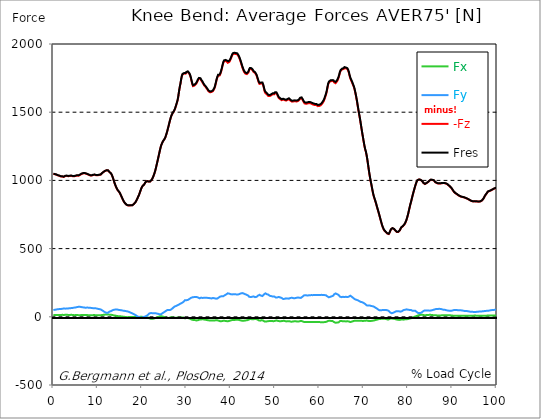
| Category |  Fx |  Fy |  -Fz |  Fres |
|---|---|---|---|---|
| 0.0 | 12.762 | 49.617 | 1047.853 | 1049.235 |
| 0.167348456675344 | 12.591 | 50.67 | 1046.466 | 1047.908 |
| 0.334696913350688 | 12.537 | 51.528 | 1045.206 | 1046.703 |
| 0.5020453700260321 | 12.957 | 52.429 | 1043.916 | 1045.474 |
| 0.669393826701376 | 13.486 | 53.829 | 1041.816 | 1043.429 |
| 0.83674228337672 | 13.048 | 54.717 | 1039.084 | 1040.715 |
| 1.0040907400520642 | 12.744 | 55.466 | 1037.002 | 1038.652 |
| 1.1621420602454444 | 12.494 | 56.147 | 1035.189 | 1036.868 |
| 1.3294905169207885 | 12.634 | 56.64 | 1033.765 | 1035.469 |
| 1.4968389735961325 | 12.914 | 56.914 | 1031.817 | 1033.54 |
| 1.6641874302714765 | 12.762 | 57.316 | 1029.048 | 1030.807 |
| 1.8315358869468206 | 13.912 | 57.736 | 1029.225 | 1031.026 |
| 1.9988843436221646 | 14.752 | 58.661 | 1028.3 | 1030.174 |
| 2.1662328002975086 | 14.143 | 59.817 | 1026.577 | 1028.513 |
| 2.333581256972853 | 13.243 | 60.815 | 1025.226 | 1027.204 |
| 2.5009297136481967 | 13.322 | 61.004 | 1027.557 | 1029.553 |
| 2.6682781703235405 | 14.715 | 59.805 | 1031.598 | 1033.546 |
| 2.8356266269988843 | 15.537 | 59.72 | 1033.527 | 1035.475 |
| 3.002975083674229 | 15.494 | 60.316 | 1033.327 | 1035.304 |
| 3.1703235403495724 | 14.977 | 60.632 | 1032.134 | 1034.112 |
| 3.337671997024917 | 13.65 | 61.326 | 1030.831 | 1032.821 |
| 3.4957233172182973 | 12.738 | 62.081 | 1030.357 | 1032.389 |
| 3.663071773893641 | 12.981 | 62.562 | 1031.848 | 1033.905 |
| 3.8304202305689854 | 14.18 | 62.836 | 1033.588 | 1035.67 |
| 3.997768687244329 | 14.685 | 63.834 | 1033.868 | 1035.998 |
| 4.165117143919673 | 14.423 | 64.686 | 1032.462 | 1034.641 |
| 4.332465600595017 | 13.535 | 65.075 | 1030.673 | 1032.864 |
| 4.499814057270361 | 12.403 | 66.286 | 1029.797 | 1032.049 |
| 4.667162513945706 | 12.062 | 67.114 | 1029.9 | 1032.195 |
| 4.834510970621049 | 12.019 | 67.795 | 1030.649 | 1032.974 |
| 5.001859427296393 | 12.494 | 68.246 | 1032.493 | 1034.836 |
| 5.169207883971737 | 13.249 | 69.585 | 1034.191 | 1036.631 |
| 5.336556340647081 | 13.596 | 70.96 | 1035.39 | 1037.915 |
| 5.503904797322425 | 12.865 | 72.36 | 1034.745 | 1037.361 |
| 5.671253253997769 | 11.812 | 73.54 | 1034.312 | 1036.996 |
| 5.82930457419115 | 11.204 | 74.082 | 1035.633 | 1038.353 |
| 5.996653030866494 | 11.794 | 73.419 | 1040.051 | 1042.723 |
| 6.164001487541838 | 12.804 | 71.861 | 1044.756 | 1047.312 |
| 6.331349944217181 | 13.255 | 71.088 | 1046.983 | 1049.484 |
| 6.498698400892526 | 13.164 | 70.924 | 1047.713 | 1050.202 |
| 6.66604685756787 | 13.942 | 69.566 | 1050.805 | 1053.209 |
| 6.833395314243213 | 14.35 | 68.532 | 1052.205 | 1054.535 |
| 7.000743770918558 | 13.821 | 67.363 | 1052.734 | 1054.986 |
| 7.168092227593902 | 13.614 | 67.132 | 1050.744 | 1052.984 |
| 7.335440684269246 | 13.742 | 66.986 | 1049.6 | 1051.839 |
| 7.50278914094459 | 13.541 | 66.889 | 1048.34 | 1050.574 |
| 7.6701375976199335 | 12.512 | 67.674 | 1045.474 | 1047.75 |
| 7.837486054295278 | 11.855 | 67.43 | 1043.234 | 1045.492 |
| 7.995537374488658 | 11.356 | 66.657 | 1040.605 | 1042.808 |
| 8.162885831164003 | 10.717 | 66.402 | 1037.568 | 1039.753 |
| 8.330234287839346 | 10.425 | 65.787 | 1035.828 | 1037.976 |
| 8.49758274451469 | 10.407 | 65.209 | 1034.763 | 1036.875 |
| 8.664931201190035 | 10.693 | 64.448 | 1035.767 | 1037.83 |
| 8.832279657865378 | 11.526 | 63.572 | 1038.128 | 1040.149 |
| 8.999628114540721 | 12.409 | 62.708 | 1039.96 | 1041.932 |
| 9.166976571216066 | 12.464 | 62.452 | 1040.648 | 1042.601 |
| 9.334325027891412 | 12.427 | 62.178 | 1040.958 | 1042.893 |
| 9.501673484566755 | 11.867 | 61.862 | 1039.528 | 1041.451 |
| 9.669021941242098 | 10.754 | 61.655 | 1037.063 | 1038.968 |
| 9.836370397917442 | 10.267 | 60.243 | 1037.039 | 1038.852 |
| 10.003718854592787 | 10.474 | 58.563 | 1037.532 | 1039.248 |
| 10.17106731126813 | 10.942 | 57.419 | 1038.646 | 1040.307 |
| 10.329118631461512 | 11.338 | 56.634 | 1040.021 | 1041.634 |
| 10.496467088136853 | 11.228 | 55.94 | 1039.205 | 1040.788 |
| 10.663815544812199 | 11.393 | 53.756 | 1042.084 | 1043.551 |
| 10.831164001487544 | 12.019 | 50.512 | 1048.103 | 1049.417 |
| 10.998512458162887 | 13.048 | 47.627 | 1053.044 | 1054.225 |
| 11.16586091483823 | 13.924 | 44.809 | 1056.714 | 1057.779 |
| 11.333209371513574 | 14.679 | 40.148 | 1062.167 | 1063.062 |
| 11.50055782818892 | 15.805 | 35.644 | 1067.693 | 1068.429 |
| 11.667906284864264 | 16.139 | 33.271 | 1069.433 | 1070.091 |
| 11.835254741539607 | 15.853 | 31.214 | 1071.162 | 1071.764 |
| 12.00260319821495 | 16.225 | 29.522 | 1073.766 | 1074.326 |
| 12.169951654890292 | 16.937 | 29.589 | 1074.576 | 1075.148 |
| 12.337300111565641 | 17.545 | 30.776 | 1073.176 | 1073.791 |
| 12.504648568240984 | 17.028 | 33.989 | 1067.845 | 1068.545 |
| 12.662699888434362 | 15.354 | 38.383 | 1060.706 | 1061.534 |
| 12.830048345109708 | 13.9 | 41.468 | 1054.335 | 1055.254 |
| 12.997396801785053 | 14.776 | 41.42 | 1050.756 | 1051.693 |
| 13.164745258460396 | 14.588 | 43.994 | 1041.299 | 1042.352 |
| 13.33209371513574 | 12.957 | 47.919 | 1027.843 | 1029.067 |
| 13.499442171811083 | 11.143 | 50.329 | 1012.252 | 1013.584 |
| 13.666790628486426 | 10.023 | 51.607 | 994.201 | 995.607 |
| 13.834139085161771 | 9.445 | 52.684 | 977.599 | 979.072 |
| 14.001487541837117 | 8.69 | 53.476 | 962.452 | 963.985 |
| 14.16883599851246 | 7.382 | 53.865 | 949.398 | 950.968 |
| 14.336184455187803 | 5.422 | 53.944 | 937.883 | 939.46 |
| 14.503532911863147 | 4.875 | 52.411 | 928.524 | 930.027 |
| 14.670881368538492 | 4.789 | 51.09 | 921.385 | 922.833 |
| 14.828932688731873 | 4.583 | 50.195 | 914.952 | 916.358 |
| 14.996281145407215 | 4.327 | 49.483 | 907.442 | 908.818 |
| 15.163629602082558 | 3.353 | 49.867 | 895.539 | 896.957 |
| 15.330978058757903 | 2.562 | 47.798 | 883.44 | 884.761 |
| 15.498326515433247 | 1.807 | 46.593 | 871.476 | 872.754 |
| 15.665674972108594 | 1.089 | 45.534 | 859.548 | 860.795 |
| 15.833023428783937 | 0.383 | 44.53 | 848.216 | 849.427 |
| 16.00037188545928 | -0.268 | 43.787 | 839.677 | 840.87 |
| 16.167720342134626 | -0.962 | 42.984 | 831.687 | 832.861 |
| 16.335068798809967 | -1.826 | 41.919 | 826.058 | 827.189 |
| 16.502417255485312 | -2.319 | 40.629 | 821.329 | 822.4 |
| 16.669765712160658 | -2.629 | 40.008 | 818.481 | 819.54 |
| 16.837114168836 | -2.495 | 38.87 | 816.509 | 817.519 |
| 17.004462625511344 | -1.984 | 36.837 | 815.517 | 816.43 |
| 17.16251394570472 | -1.789 | 33.861 | 816.119 | 816.911 |
| 17.32986240238007 | -1.509 | 31.305 | 818.036 | 818.718 |
| 17.497210859055414 | -1.661 | 29.504 | 817.227 | 817.842 |
| 17.664559315730756 | -1.552 | 27.307 | 816.838 | 817.379 |
| 17.8319077724061 | -1.759 | 25.238 | 818.055 | 818.529 |
| 17.999256229081443 | -1.954 | 22.091 | 821.639 | 822.047 |
| 18.166604685756788 | -1.966 | 19.048 | 826.928 | 827.275 |
| 18.333953142432133 | -2.094 | 16.425 | 832.831 | 833.123 |
| 18.501301599107478 | -2.313 | 13.985 | 839.087 | 839.331 |
| 18.668650055782823 | -1.789 | 9.737 | 848.417 | 848.611 |
| 18.835998512458165 | -1.448 | 5.587 | 858.44 | 858.604 |
| 19.00334696913351 | -1.047 | 1.704 | 870.313 | 870.484 |
| 19.170695425808855 | -0.876 | -0.572 | 883.714 | 883.884 |
| 19.338043882484197 | -1.899 | 0.146 | 894.455 | 894.608 |
| 19.496095202677576 | -0.682 | -4.084 | 909.962 | 910.065 |
| 19.66344365935292 | -0.128 | -6.591 | 925.876 | 925.986 |
| 19.830792116028263 | 0.243 | -8.033 | 940.482 | 940.598 |
| 19.998140572703612 | 0.274 | -7.485 | 952.672 | 952.788 |
| 20.165489029378953 | -0.913 | -4.99 | 960.23 | 960.34 |
| 20.3328374860543 | -2.818 | -1.156 | 965.379 | 965.507 |
| 20.500185942729644 | -4.558 | 2.288 | 970.68 | 970.844 |
| 20.667534399404985 | -3.298 | 0.815 | 980.91 | 981.025 |
| 20.83488285608033 | -2.812 | 1.601 | 988.73 | 988.809 |
| 21.002231312755672 | -3.232 | 6.244 | 991.962 | 992.077 |
| 21.16957976943102 | -3.183 | 9.317 | 994.597 | 994.731 |
| 21.336928226106362 | -4.82 | 14.198 | 994.128 | 994.329 |
| 21.504276682781704 | -7.826 | 19.785 | 991.426 | 991.743 |
| 21.67162513945705 | -10.918 | 24.526 | 989.819 | 990.252 |
| 21.82967645965043 | -13.237 | 26.984 | 991.925 | 992.442 |
| 21.997024916325774 | -14.308 | 27.362 | 996.946 | 997.494 |
| 22.16437337300112 | -14.995 | 27.556 | 1003.805 | 1004.383 |
| 22.33172182967646 | -14.569 | 26.637 | 1013.402 | 1013.998 |
| 22.499070286351806 | -14.07 | 26.09 | 1024.746 | 1025.366 |
| 22.666418743027148 | -12.786 | 26.777 | 1039.053 | 1039.68 |
| 22.833767199702496 | -11.246 | 27.483 | 1054.438 | 1055.065 |
| 23.00111565637784 | -9.183 | 26.443 | 1072.714 | 1073.28 |
| 23.168464113053183 | -6.688 | 24.733 | 1095.109 | 1095.572 |
| 23.335812569728528 | -4.863 | 23.625 | 1118.363 | 1118.759 |
| 23.50316102640387 | -3.122 | 22.968 | 1142.018 | 1142.377 |
| 23.670509483079215 | -1.071 | 21.702 | 1165.941 | 1166.24 |
| 23.83785793975456 | 2.611 | 17.259 | 1191.155 | 1191.356 |
| 23.995909259947936 | 3.359 | 17.996 | 1215.449 | 1215.662 |
| 24.163257716623285 | 3.98 | 17.801 | 1238.873 | 1239.074 |
| 24.330606173298627 | 4.023 | 19.675 | 1257.362 | 1257.599 |
| 24.49795462997397 | 3.189 | 23.491 | 1270.763 | 1271.091 |
| 24.665303086649313 | 2.136 | 27.611 | 1282.24 | 1282.697 |
| 24.83265154332466 | 0.554 | 32.054 | 1291.911 | 1292.525 |
| 25.0 | -2.221 | 34.184 | 1297.272 | 1297.954 |
| 25.167348456675345 | -4.497 | 37.574 | 1307.776 | 1308.567 |
| 25.334696913350694 | -6.451 | 41.645 | 1322.011 | 1322.948 |
| 25.502045370026035 | -8.222 | 45.941 | 1338.942 | 1340.013 |
| 25.669393826701377 | -9.25 | 48.942 | 1357.302 | 1358.483 |
| 25.836742283376722 | -9.056 | 49.934 | 1377.793 | 1379.041 |
| 26.004090740052067 | -8.392 | 50.311 | 1398.899 | 1400.183 |
| 26.17143919672741 | -6.986 | 49.459 | 1421.519 | 1422.803 |
| 26.329490516920792 | -5.136 | 49.739 | 1442.339 | 1443.629 |
| 26.49683897359613 | -3.469 | 51.169 | 1461.661 | 1462.969 |
| 26.66418743027148 | -3.913 | 55.399 | 1476.839 | 1478.269 |
| 26.831535886946828 | -5.142 | 61.144 | 1487.915 | 1489.564 |
| 26.998884343622166 | -5.964 | 65.848 | 1496.843 | 1498.602 |
| 27.166232800297514 | -6.548 | 70.199 | 1506.306 | 1508.193 |
| 27.333581256972852 | -7.133 | 74.551 | 1515.77 | 1517.778 |
| 27.5009297136482 | -6.859 | 77.344 | 1530.248 | 1532.347 |
| 27.668278170323543 | -6.183 | 79.456 | 1547.093 | 1549.253 |
| 27.835626626998888 | -5.404 | 81.361 | 1565.326 | 1567.541 |
| 28.002975083674233 | -5.879 | 84.994 | 1583.711 | 1586.097 |
| 28.170323540349575 | -6.609 | 86.381 | 1610.738 | 1613.172 |
| 28.33767199702492 | -8.313 | 90.002 | 1648.159 | 1650.728 |
| 28.50502045370026 | -8.398 | 93.447 | 1680.791 | 1683.463 |
| 28.663071773893645 | -7.047 | 96.721 | 1707.69 | 1710.49 |
| 28.830420230568986 | -5.909 | 99.727 | 1740.158 | 1743.055 |
| 28.99776868724433 | -4.978 | 102.083 | 1765.968 | 1768.944 |
| 29.165117143919673 | -4.528 | 104.626 | 1778.34 | 1781.444 |
| 29.33246560059502 | -5.118 | 108.728 | 1783.75 | 1787.097 |
| 29.499814057270367 | -7.066 | 114.248 | 1783.117 | 1786.817 |
| 29.66716251394571 | -10.681 | 121.21 | 1779.003 | 1783.19 |
| 29.834510970621054 | -10.303 | 121.983 | 1782.728 | 1786.957 |
| 30.00185942729639 | -9.208 | 121.557 | 1791.26 | 1795.435 |
| 30.169207883971744 | -8.216 | 121.563 | 1798.167 | 1802.324 |
| 30.33655634064708 | -8.21 | 123.565 | 1795.149 | 1799.445 |
| 30.50390479732243 | -9.926 | 127.034 | 1791.102 | 1795.666 |
| 30.671253253997772 | -12.251 | 130.57 | 1782.223 | 1787.079 |
| 30.829304574191156 | -14.484 | 133.491 | 1770.088 | 1775.212 |
| 30.996653030866494 | -17.637 | 138.037 | 1752.147 | 1757.752 |
| 31.164001487541842 | -19.59 | 140.672 | 1729.094 | 1735.064 |
| 31.331349944217187 | -21.361 | 142.523 | 1706.205 | 1712.474 |
| 31.498698400892525 | -22.889 | 143.874 | 1691.259 | 1697.722 |
| 31.666046857567874 | -23.881 | 144.184 | 1690.754 | 1697.205 |
| 31.833395314243212 | -23.637 | 143.393 | 1695.336 | 1701.684 |
| 32.00074377091856 | -24.434 | 145.377 | 1700.844 | 1707.337 |
| 32.1680922275939 | -26.284 | 146.509 | 1705.84 | 1712.395 |
| 32.33544068426925 | -26.595 | 145.45 | 1714.519 | 1720.939 |
| 32.50278914094459 | -26.071 | 143.74 | 1726.161 | 1732.38 |
| 32.670137597619934 | -24.489 | 140.752 | 1737.486 | 1743.395 |
| 32.83748605429528 | -22.213 | 137.484 | 1745.86 | 1751.453 |
| 33.004834510970625 | -20.235 | 135.591 | 1749.055 | 1754.465 |
| 33.162885831164004 | -19.675 | 137.916 | 1744.034 | 1749.646 |
| 33.33023428783935 | -19.858 | 140.484 | 1734.474 | 1740.334 |
| 33.497582744514695 | -18.835 | 140.283 | 1725.948 | 1731.814 |
| 33.664931201190036 | -17.229 | 138.22 | 1718.669 | 1724.384 |
| 33.83227965786538 | -17.85 | 138.628 | 1707.599 | 1713.399 |
| 33.99962811454073 | -19.992 | 139.388 | 1697.716 | 1703.643 |
| 34.16697657121607 | -20.655 | 139.254 | 1692.725 | 1698.671 |
| 34.33432502789141 | -21.744 | 139.577 | 1685.496 | 1691.496 |
| 34.50167348456676 | -22.925 | 139.528 | 1677.517 | 1683.548 |
| 34.6690219412421 | -23.984 | 138.987 | 1669.837 | 1675.862 |
| 34.83637039791744 | -25.037 | 138.457 | 1662.102 | 1668.127 |
| 35.00371885459279 | -26.09 | 138.11 | 1652.906 | 1658.962 |
| 35.17106731126814 | -26.808 | 137.331 | 1647.557 | 1653.57 |
| 35.338415767943474 | -26.911 | 136.479 | 1646.09 | 1652.036 |
| 35.49646708813686 | -26.832 | 135.64 | 1646.273 | 1652.152 |
| 35.6638155448122 | -26.826 | 134.641 | 1647.63 | 1653.43 |
| 35.831164001487544 | -27.234 | 135.676 | 1651.409 | 1657.294 |
| 35.998512458162885 | -28.068 | 137.903 | 1654.288 | 1660.355 |
| 36.165860914838234 | -28.25 | 138.025 | 1660.428 | 1666.49 |
| 36.333209371513576 | -27.307 | 135.865 | 1673.677 | 1679.507 |
| 36.50055782818892 | -26.51 | 134.635 | 1690.967 | 1696.639 |
| 36.667906284864266 | -25.359 | 133.017 | 1713.32 | 1718.785 |
| 36.83525474153961 | -25.104 | 131.982 | 1738.016 | 1743.341 |
| 37.002603198214956 | -25.408 | 133.686 | 1754.825 | 1760.223 |
| 37.1699516548903 | -27.045 | 137.824 | 1769.004 | 1774.701 |
| 37.337300111565646 | -29.005 | 141.944 | 1772.887 | 1778.942 |
| 37.50464856824098 | -31.293 | 146.856 | 1769.424 | 1775.96 |
| 37.66269988843437 | -32.486 | 148.961 | 1779.381 | 1786.069 |
| 37.83004834510971 | -32.571 | 149.905 | 1796.238 | 1802.939 |
| 37.99739680178505 | -31.689 | 150.458 | 1816.291 | 1822.943 |
| 38.16474525846039 | -29.784 | 150.349 | 1840.494 | 1847 |
| 38.33209371513574 | -29.23 | 150.854 | 1860.425 | 1866.894 |
| 38.49944217181109 | -29.157 | 153.574 | 1873.339 | 1879.978 |
| 38.666790628486424 | -29.674 | 158.084 | 1877.988 | 1885.011 |
| 38.83413908516178 | -30.891 | 161.431 | 1876.071 | 1883.417 |
| 39.001487541837115 | -31.299 | 164.224 | 1875.913 | 1883.514 |
| 39.16883599851246 | -32.455 | 168.521 | 1869.748 | 1877.787 |
| 39.336184455187805 | -33.064 | 172.008 | 1862.111 | 1870.527 |
| 39.503532911863154 | -31.628 | 171.418 | 1865.007 | 1873.333 |
| 39.670881368538495 | -30.21 | 169.799 | 1868.068 | 1876.205 |
| 39.83822982521384 | -28.323 | 166.787 | 1876.272 | 1884.056 |
| 39.996281145407224 | -26.856 | 165.728 | 1889.217 | 1896.848 |
| 40.163629602082565 | -25.432 | 164.851 | 1902.252 | 1909.744 |
| 40.33097805875791 | -23.935 | 163.981 | 1916.536 | 1923.899 |
| 40.498326515433256 | -23.801 | 165.454 | 1924.849 | 1932.298 |
| 40.6656749721086 | -23.832 | 166.172 | 1927.861 | 1935.359 |
| 40.83302342878393 | -23.503 | 166.184 | 1928.311 | 1935.809 |
| 41.00037188545929 | -22.627 | 165.247 | 1928.464 | 1935.87 |
| 41.16772034213463 | -22.517 | 164.736 | 1926.729 | 1934.099 |
| 41.33506879880997 | -22.049 | 163.89 | 1925.603 | 1932.894 |
| 41.50241725548531 | -21.708 | 163.172 | 1923.966 | 1931.196 |
| 41.66976571216066 | -21.921 | 163.543 | 1919.152 | 1926.443 |
| 41.837114168836 | -23.156 | 166.269 | 1906.281 | 1913.876 |
| 42.004462625511344 | -23.947 | 167.219 | 1892.971 | 1900.713 |
| 42.17181108218669 | -25.238 | 169.196 | 1877.769 | 1885.772 |
| 42.32986240238007 | -26.984 | 171.88 | 1860.638 | 1868.981 |
| 42.497210859055414 | -28.901 | 173.53 | 1841.881 | 1850.481 |
| 42.66455931573076 | -29.559 | 173.633 | 1825.182 | 1833.885 |
| 42.831907772406105 | -28.993 | 171.655 | 1810.576 | 1819.163 |
| 42.999256229081446 | -28.433 | 169.677 | 1795.964 | 1804.436 |
| 43.16660468575679 | -27.155 | 166.269 | 1789.313 | 1797.498 |
| 43.33395314243214 | -26.966 | 164.955 | 1782.204 | 1790.298 |
| 43.50130159910748 | -26.954 | 164.024 | 1775.254 | 1783.294 |
| 43.66865005578282 | -25.031 | 160.092 | 1779.082 | 1786.72 |
| 43.83599851245817 | -24.629 | 159.392 | 1781.054 | 1788.631 |
| 44.00334696913351 | -22.189 | 154.822 | 1791.138 | 1798.216 |
| 44.17069542580886 | -18.16 | 147.087 | 1808.665 | 1815.001 |
| 44.3380438824842 | -16.48 | 144.147 | 1818.269 | 1824.318 |
| 44.49609520267758 | -16.675 | 144.622 | 1818.81 | 1824.902 |
| 44.66344365935292 | -17.04 | 145.237 | 1816.863 | 1823.016 |
| 44.83079211602827 | -17.521 | 146.807 | 1811.471 | 1817.77 |
| 44.99814057270361 | -17.728 | 147.476 | 1804.734 | 1811.118 |
| 45.16548902937895 | -18.629 | 149.582 | 1795.039 | 1801.642 |
| 45.332837486054295 | -17.022 | 147.215 | 1790.012 | 1796.409 |
| 45.500185942729644 | -15.47 | 143.934 | 1787.657 | 1793.743 |
| 45.66753439940499 | -15.391 | 143.959 | 1781.133 | 1787.225 |
| 45.83488285608033 | -16.407 | 146.083 | 1769.497 | 1775.802 |
| 46.00223131275568 | -19.572 | 150.057 | 1752.439 | 1759.158 |
| 46.16957976943102 | -22.749 | 155.357 | 1734.182 | 1741.466 |
| 46.336928226106366 | -25.986 | 159.246 | 1717.647 | 1725.394 |
| 46.50427668278171 | -28.092 | 161.273 | 1707.246 | 1715.255 |
| 46.671625139457056 | -28.049 | 160.104 | 1704.611 | 1712.516 |
| 46.829676459650436 | -25.706 | 155.108 | 1710.003 | 1717.367 |
| 46.99702491632577 | -24.483 | 152.521 | 1712.699 | 1719.777 |
| 47.16437337300112 | -24.757 | 152.187 | 1710.642 | 1717.689 |
| 47.33172182967646 | -27.812 | 156.934 | 1696.821 | 1704.41 |
| 47.49907028635181 | -31.445 | 163.817 | 1675.058 | 1683.554 |
| 47.66641874302716 | -35.048 | 170.894 | 1651.653 | 1661.128 |
| 47.83376719970249 | -35.93 | 171.886 | 1640.351 | 1650.015 |
| 48.001115656377834 | -35.036 | 169.744 | 1633.979 | 1643.443 |
| 48.16846411305319 | -33.125 | 165.588 | 1630.511 | 1639.554 |
| 48.33581256972853 | -32.011 | 162.411 | 1625.965 | 1634.685 |
| 48.50316102640387 | -32.973 | 162.569 | 1618.394 | 1627.17 |
| 48.67050948307921 | -31.488 | 157.652 | 1616.373 | 1624.571 |
| 48.837857939754564 | -30.216 | 153.653 | 1618.321 | 1626.08 |
| 49.005206396429905 | -30.849 | 152.777 | 1619.921 | 1627.602 |
| 49.163257716623285 | -31.36 | 151.694 | 1624.668 | 1632.245 |
| 49.33060617329863 | -30.471 | 148.669 | 1629.482 | 1636.712 |
| 49.49795462997397 | -30.697 | 148.432 | 1631.6 | 1638.781 |
| 49.66530308664932 | -32.674 | 151.749 | 1628.058 | 1635.58 |
| 49.832651543324666 | -31.987 | 149.296 | 1631.393 | 1638.659 |
| 50.0 | -29.425 | 144.616 | 1639.39 | 1646.194 |
| 50.16734845667534 | -27.264 | 141.421 | 1646.09 | 1652.578 |
| 50.33469691335069 | -27.143 | 140.666 | 1639.055 | 1645.488 |
| 50.50204537002604 | -28.189 | 142.072 | 1628.472 | 1635.044 |
| 50.66939382670139 | -30.167 | 144.233 | 1616.112 | 1622.903 |
| 50.836742283376715 | -32.121 | 145.797 | 1605.017 | 1611.992 |
| 51.00409074005207 | -32.267 | 143.807 | 1600.045 | 1606.861 |
| 51.17143919672741 | -32.096 | 141.987 | 1595.883 | 1602.547 |
| 51.32949051692079 | -32.182 | 140.38 | 1591.525 | 1598.061 |
| 51.496838973596134 | -32.035 | 138.36 | 1588.269 | 1594.641 |
| 51.66418743027148 | -30.782 | 134.556 | 1589.846 | 1595.864 |
| 51.831535886946824 | -29.266 | 130.655 | 1593.241 | 1598.901 |
| 51.99888434362217 | -29.084 | 129.962 | 1592.481 | 1598.08 |
| 52.16623280029752 | -30.362 | 131.781 | 1588.586 | 1594.361 |
| 52.33358125697285 | -32.023 | 133.832 | 1585.245 | 1591.233 |
| 52.5009297136482 | -33.046 | 135.25 | 1585.062 | 1591.197 |
| 52.668278170323546 | -33.715 | 135.676 | 1586.218 | 1592.395 |
| 52.835626626998895 | -33.411 | 133.929 | 1590.612 | 1596.631 |
| 53.00297508367424 | -32.687 | 132.487 | 1595.116 | 1600.995 |
| 53.17032354034958 | -32.687 | 132.962 | 1596.059 | 1601.987 |
| 53.33767199702492 | -33.387 | 135.329 | 1591.708 | 1597.86 |
| 53.50502045370027 | -35.078 | 138.451 | 1584.222 | 1590.691 |
| 53.663071773893655 | -36.271 | 140.161 | 1578.063 | 1584.715 |
| 53.83042023056899 | -35.863 | 139.388 | 1577.412 | 1583.985 |
| 53.99776868724433 | -34.707 | 137.964 | 1578.295 | 1584.721 |
| 54.16511714391967 | -33.533 | 136.565 | 1579.159 | 1585.433 |
| 54.33246560059503 | -32.802 | 135.889 | 1580.017 | 1586.218 |
| 54.49981405727037 | -32.754 | 136.285 | 1580.869 | 1587.107 |
| 54.667162513945705 | -32.705 | 136.68 | 1581.727 | 1587.989 |
| 54.834510970621054 | -33.946 | 139.595 | 1578.514 | 1585.074 |
| 55.0018594272964 | -34.561 | 140.697 | 1578.733 | 1585.397 |
| 55.169207883971744 | -34.531 | 141.135 | 1581.155 | 1587.849 |
| 55.336556340647086 | -34.409 | 141.531 | 1583.851 | 1590.576 |
| 55.50390479732243 | -33.228 | 140.033 | 1590.837 | 1597.386 |
| 55.671253253997776 | -31.579 | 138.183 | 1599.345 | 1605.662 |
| 55.83860171067312 | -30.496 | 138.549 | 1604.628 | 1610.951 |
| 55.9966530308665 | -30.891 | 141.5 | 1602.029 | 1608.626 |
| 56.16400148754184 | -32.711 | 146.551 | 1593.357 | 1600.477 |
| 56.33134994421718 | -35.218 | 151.858 | 1582.062 | 1589.791 |
| 56.498698400892536 | -37.026 | 156.094 | 1573.152 | 1581.435 |
| 56.66604685756788 | -38.785 | 160.19 | 1564.437 | 1573.262 |
| 56.83339531424321 | -38.645 | 158.772 | 1562.953 | 1571.649 |
| 57.00074377091856 | -38.499 | 157.354 | 1561.462 | 1570.036 |
| 57.16809222759391 | -38.389 | 156.848 | 1562.015 | 1570.541 |
| 57.33544068426925 | -38.292 | 156.891 | 1563.774 | 1572.3 |
| 57.5027891409446 | -38.182 | 157.013 | 1565.472 | 1573.998 |
| 57.670137597619934 | -38.03 | 157.402 | 1566.945 | 1575.495 |
| 57.83748605429528 | -37.878 | 157.792 | 1568.424 | 1576.992 |
| 58.004834510970625 | -38.298 | 158.516 | 1565.296 | 1573.949 |
| 58.16288583116401 | -38.559 | 159.033 | 1562.174 | 1570.907 |
| 58.330234287839346 | -38.499 | 159.179 | 1560.031 | 1568.813 |
| 58.497582744514695 | -38.359 | 158.832 | 1557.774 | 1566.531 |
| 58.66493120119004 | -38.219 | 158.486 | 1555.516 | 1564.249 |
| 58.832279657865385 | -38.76 | 159.161 | 1553.513 | 1562.338 |
| 58.999628114540734 | -38.918 | 160.117 | 1552.12 | 1561.048 |
| 59.16697657121607 | -38.705 | 160.439 | 1551.846 | 1560.804 |
| 59.33432502789142 | -38.176 | 159.837 | 1551.816 | 1560.695 |
| 59.50167348456676 | -38.383 | 159.721 | 1548.17 | 1557.061 |
| 59.66902194124211 | -38.59 | 159.599 | 1544.531 | 1553.428 |
| 59.83637039791745 | -38.596 | 159.392 | 1544.908 | 1553.781 |
| 60.00371885459278 | -38.596 | 159.179 | 1545.541 | 1554.39 |
| 60.17106731126813 | -38.791 | 159.228 | 1547.044 | 1555.899 |
| 60.33841576794349 | -39.624 | 160.129 | 1551.298 | 1560.25 |
| 60.49646708813685 | -40.458 | 161.029 | 1555.552 | 1564.596 |
| 60.6638155448122 | -40.27 | 160.676 | 1563.665 | 1572.635 |
| 60.831164001487544 | -39.57 | 159.904 | 1572.69 | 1581.532 |
| 60.99851245816289 | -39.667 | 159.958 | 1580.699 | 1589.517 |
| 61.16586091483824 | -38.943 | 159.082 | 1595.329 | 1603.983 |
| 61.333209371513576 | -37.981 | 157.944 | 1611.846 | 1620.299 |
| 61.50055782818892 | -37.403 | 157.725 | 1626.981 | 1635.343 |
| 61.667906284864266 | -35.991 | 155.004 | 1649.291 | 1657.251 |
| 61.835254741539615 | -32.954 | 149.01 | 1678.162 | 1685.356 |
| 62.002603198214956 | -30.088 | 143.539 | 1704.641 | 1711.129 |
| 62.16995165489029 | -29.2 | 142.967 | 1717.428 | 1723.799 |
| 62.33730011156564 | -29.2 | 144.354 | 1724.25 | 1730.713 |
| 62.504648568240995 | -29.79 | 146.91 | 1726.921 | 1733.597 |
| 62.67199702491633 | -30.502 | 149.393 | 1727.359 | 1734.236 |
| 62.83004834510971 | -30.891 | 150.732 | 1728.254 | 1735.228 |
| 62.99739680178505 | -31.33 | 151.913 | 1729.757 | 1736.811 |
| 63.1647452584604 | -33.533 | 155.637 | 1727.621 | 1735.028 |
| 63.33209371513575 | -38.809 | 164.571 | 1718.785 | 1727.116 |
| 63.4994421718111 | -42.509 | 170.9 | 1711.871 | 1720.951 |
| 63.666790628486424 | -43.233 | 171.296 | 1712.553 | 1721.718 |
| 63.83413908516177 | -42.966 | 168.947 | 1718.523 | 1727.439 |
| 64.00148754183712 | -42.466 | 166.543 | 1726.021 | 1734.668 |
| 64.16883599851248 | -42.187 | 164.395 | 1736.707 | 1745.087 |
| 64.3361844551878 | -40.835 | 160.719 | 1750.863 | 1758.799 |
| 64.50353291186315 | -36.88 | 154.451 | 1770.526 | 1777.701 |
| 64.6708813685385 | -31.67 | 147.434 | 1792.185 | 1798.563 |
| 64.83822982521384 | -29.516 | 144.36 | 1804.308 | 1810.351 |
| 65.00557828188919 | -30.964 | 143.758 | 1809.511 | 1815.524 |
| 65.16362960208257 | -31.214 | 143.697 | 1813.96 | 1819.967 |
| 65.3309780587579 | -32.796 | 146.478 | 1813.205 | 1819.468 |
| 65.49832651543326 | -33.703 | 147.178 | 1816.93 | 1823.265 |
| 65.6656749721086 | -32.601 | 144.756 | 1824.787 | 1830.897 |
| 65.83302342878395 | -32.705 | 145.413 | 1825.937 | 1832.096 |
| 66.00037188545929 | -33.94 | 146.77 | 1821.172 | 1827.495 |
| 66.16772034213463 | -33.679 | 146.144 | 1818.293 | 1824.592 |
| 66.33506879880998 | -32.778 | 144.415 | 1816.492 | 1822.663 |
| 66.50241725548531 | -33.034 | 145.066 | 1805.026 | 1811.3 |
| 66.66976571216065 | -34.178 | 147.75 | 1789.294 | 1795.885 |
| 66.83711416883601 | -37.318 | 153.927 | 1764.769 | 1772.151 |
| 67.00446262551135 | -38.492 | 154.858 | 1746.122 | 1753.753 |
| 67.1718110821867 | -37.72 | 152.089 | 1732.849 | 1740.347 |
| 67.32986240238007 | -35.291 | 146.637 | 1721.578 | 1728.656 |
| 67.49721085905541 | -33.739 | 142.456 | 1708.055 | 1714.774 |
| 67.66455931573076 | -31.591 | 137.465 | 1694.496 | 1700.74 |
| 67.83190777240611 | -29.443 | 132.481 | 1680.931 | 1686.707 |
| 67.99925622908145 | -28.512 | 129.158 | 1660.027 | 1665.565 |
| 68.16660468575678 | -28.475 | 127.107 | 1633.986 | 1639.451 |
| 68.33395314243214 | -28.262 | 125.032 | 1607.184 | 1612.576 |
| 68.50130159910749 | -28.171 | 122.853 | 1577.832 | 1583.157 |
| 68.66865005578282 | -29.084 | 121.514 | 1543.168 | 1548.499 |
| 68.83599851245816 | -29.498 | 119.044 | 1510.116 | 1515.344 |
| 69.00334696913352 | -28.865 | 115.191 | 1479.961 | 1484.957 |
| 69.17069542580886 | -28.293 | 111.71 | 1449.782 | 1454.583 |
| 69.3380438824842 | -28.463 | 109.282 | 1416.279 | 1420.984 |
| 69.50539233915956 | -29.133 | 107.895 | 1381.232 | 1385.93 |
| 69.66344365935292 | -29.948 | 107.049 | 1347.334 | 1352.075 |
| 69.83079211602826 | -29.759 | 103.902 | 1315.469 | 1320.051 |
| 69.99814057270362 | -29.899 | 101.188 | 1283.476 | 1287.949 |
| 70.16548902937896 | -30.258 | 98.675 | 1252.901 | 1257.277 |
| 70.33283748605429 | -29.546 | 94.384 | 1227.56 | 1231.692 |
| 70.50018594272964 | -28.171 | 89.041 | 1208.56 | 1212.358 |
| 70.667534399405 | -27.368 | 84.136 | 1183.073 | 1186.566 |
| 70.83488285608033 | -27.818 | 82.103 | 1150.033 | 1153.49 |
| 71.00223131275568 | -29.346 | 82.456 | 1112.642 | 1116.312 |
| 71.16957976943102 | -30.885 | 83.472 | 1074.107 | 1078.106 |
| 71.33692822610637 | -31.664 | 83.478 | 1038.286 | 1042.498 |
| 71.50427668278171 | -31.135 | 81.641 | 1007.833 | 1012.008 |
| 71.67162513945706 | -30.204 | 79.444 | 979.388 | 983.472 |
| 71.8389735961324 | -29.613 | 78.281 | 951.376 | 955.435 |
| 71.99702491632577 | -29.139 | 77.575 | 922.919 | 926.96 |
| 72.16437337300113 | -28.372 | 76.504 | 896.78 | 900.772 |
| 72.33172182967647 | -26.887 | 74.289 | 877.075 | 880.902 |
| 72.49907028635181 | -25.134 | 70.674 | 860.333 | 863.893 |
| 72.66641874302715 | -23.394 | 66.81 | 843.28 | 846.579 |
| 72.8337671997025 | -21.848 | 63.17 | 825.668 | 828.723 |
| 73.00111565637783 | -21.136 | 60.444 | 805.469 | 808.378 |
| 73.16846411305319 | -19.511 | 56.135 | 787.017 | 789.61 |
| 73.33581256972853 | -17.892 | 51.826 | 768.559 | 770.841 |
| 73.50316102640387 | -16.292 | 47.998 | 749.718 | 751.726 |
| 73.67050948307921 | -15.64 | 47.11 | 729.008 | 731.022 |
| 73.83785793975457 | -15.573 | 47.487 | 708.383 | 710.513 |
| 74.00520639642991 | -15.129 | 48.078 | 688.757 | 691.008 |
| 74.16325771662328 | -14.448 | 48.65 | 669.586 | 671.942 |
| 74.33060617329863 | -14.192 | 50.08 | 654.676 | 657.19 |
| 74.49795462997398 | -13.809 | 50.761 | 642.012 | 644.623 |
| 74.66530308664932 | -13.754 | 49.623 | 632.53 | 635.086 |
| 74.83265154332466 | -14.581 | 49.24 | 626.195 | 628.702 |
| 75.00000000000001 | -15.726 | 49.69 | 620.839 | 623.341 |
| 75.16734845667534 | -17.253 | 49.416 | 615.441 | 617.918 |
| 75.3346969133507 | -19.213 | 48.327 | 610.007 | 612.435 |
| 75.50204537002605 | -20.235 | 46.514 | 606.276 | 608.571 |
| 75.66939382670138 | -19.012 | 42.972 | 606.666 | 608.637 |
| 75.83674228337672 | -16.407 | 37.154 | 616.445 | 617.876 |
| 76.00409074005208 | -13.535 | 31.64 | 629.378 | 630.37 |
| 76.17143919672742 | -11.715 | 27.599 | 641.093 | 641.829 |
| 76.33878765340276 | -11.253 | 26.096 | 647.653 | 648.304 |
| 76.49683897359614 | -12.549 | 27.222 | 649.789 | 650.514 |
| 76.66418743027148 | -14.478 | 29.461 | 647.854 | 648.73 |
| 76.83153588694682 | -14.831 | 31.859 | 644.276 | 645.274 |
| 76.99888434362218 | -15.227 | 35.297 | 638.446 | 639.632 |
| 77.16623280029752 | -17.162 | 38.468 | 631.733 | 633.175 |
| 77.33358125697285 | -19.304 | 40.653 | 625.805 | 627.461 |
| 77.5009297136482 | -19.876 | 40.89 | 621.198 | 622.909 |
| 77.66827817032356 | -21.221 | 40.732 | 620.17 | 621.929 |
| 77.83562662699889 | -22.335 | 40.647 | 622.227 | 624.022 |
| 78.00297508367423 | -22.803 | 40.148 | 626.791 | 628.581 |
| 78.17032354034959 | -22.7 | 39.15 | 634.271 | 635.993 |
| 78.33767199702493 | -21.069 | 37.695 | 644.884 | 646.497 |
| 78.50502045370027 | -18.452 | 37.64 | 655.242 | 656.77 |
| 78.67236891037561 | -19.304 | 41.298 | 659.417 | 661.127 |
| 78.83042023056899 | -20.18 | 45.327 | 663.251 | 665.217 |
| 78.99776868724433 | -21.057 | 49.356 | 667.085 | 669.313 |
| 79.16511714391969 | -19.602 | 50.281 | 675.325 | 677.559 |
| 79.33246560059503 | -18.239 | 51.461 | 684.357 | 686.62 |
| 79.49981405727036 | -17.551 | 53.123 | 695.938 | 698.293 |
| 79.66716251394571 | -17.728 | 54.632 | 710.02 | 712.467 |
| 79.83451097062107 | -17.965 | 54.656 | 727.906 | 730.347 |
| 80.00185942729641 | -16.62 | 52.192 | 748.33 | 750.515 |
| 80.16920788397174 | -14.922 | 50.609 | 771.273 | 773.203 |
| 80.33655634064709 | -12.999 | 50.244 | 795.635 | 797.406 |
| 80.50390479732243 | -12.123 | 51.851 | 818.523 | 820.313 |
| 80.67125325399778 | -10.62 | 50.311 | 839.391 | 841.041 |
| 80.83860171067312 | -8.63 | 47.213 | 861.112 | 862.542 |
| 80.99665303086651 | -6.262 | 44.67 | 883.471 | 884.694 |
| 81.16400148754184 | -3.974 | 44.505 | 904.296 | 905.495 |
| 81.3313499442172 | -1.594 | 43.726 | 924.105 | 925.262 |
| 81.49869840089255 | 0.487 | 43.416 | 943.44 | 944.578 |
| 81.66604685756786 | 2.282 | 43.525 | 962.348 | 963.486 |
| 81.83339531424322 | 4.394 | 39.411 | 978.695 | 979.644 |
| 82.00074377091858 | 6.609 | 34.275 | 993.763 | 994.493 |
| 82.16809222759392 | 9.086 | 29.619 | 1002.076 | 1002.66 |
| 82.33544068426926 | 11.064 | 27.319 | 1005.332 | 1005.849 |
| 82.50278914094459 | 12.464 | 26.631 | 1006.5 | 1006.987 |
| 82.67013759761994 | 13.583 | 26.869 | 1005.947 | 1006.44 |
| 82.83748605429528 | 14.32 | 28.171 | 1004.188 | 1004.717 |
| 83.00483451097062 | 14.959 | 30.496 | 1001.236 | 1001.851 |
| 83.17218296764597 | 14.868 | 34.026 | 996.027 | 996.775 |
| 83.33023428783935 | 14.162 | 38.298 | 988.943 | 989.874 |
| 83.4975827445147 | 12.823 | 42.667 | 980.606 | 981.719 |
| 83.66493120119004 | 11.855 | 45.473 | 975.165 | 976.406 |
| 83.83227965786537 | 11.435 | 46.252 | 973.54 | 974.8 |
| 83.99962811454073 | 11.959 | 46.325 | 975.548 | 976.796 |
| 84.16697657121607 | 12.64 | 45.601 | 979.857 | 981.056 |
| 84.33432502789142 | 13.206 | 45.582 | 983.168 | 984.36 |
| 84.50167348456677 | 13.711 | 45.528 | 987.13 | 988.322 |
| 84.6690219412421 | 13.967 | 45.43 | 991.724 | 992.911 |
| 84.83637039791745 | 14.387 | 45.059 | 997.554 | 998.717 |
| 85.0037188545928 | 14.594 | 45.138 | 1002.149 | 1003.305 |
| 85.17106731126813 | 14.46 | 45.948 | 1004.778 | 1005.965 |
| 85.33841576794349 | 13.553 | 47.627 | 1003.914 | 1005.174 |
| 85.50576422461883 | 12.713 | 49.301 | 1003.269 | 1004.602 |
| 85.66381554481221 | 12.184 | 50.5 | 1002.892 | 1004.273 |
| 85.83116400148755 | 11.952 | 51.887 | 999.94 | 1001.413 |
| 85.99851245816289 | 11.514 | 53.932 | 993.465 | 995.084 |
| 86.16586091483823 | 11.04 | 56.032 | 986.497 | 988.274 |
| 86.33320937151358 | 10.924 | 57.182 | 982.796 | 984.659 |
| 86.50055782818893 | 10.431 | 57.346 | 980.575 | 982.443 |
| 86.66790628486427 | 9.908 | 57.486 | 978.336 | 980.21 |
| 86.83525474153961 | 9.457 | 57.723 | 976.406 | 978.293 |
| 87.00260319821496 | 9.384 | 58.326 | 976.072 | 978.001 |
| 87.16995165489031 | 9.506 | 58.527 | 976.406 | 978.36 |
| 87.33730011156564 | 9.816 | 57.906 | 976.747 | 978.682 |
| 87.504648568241 | 10.394 | 56.433 | 978.153 | 980.027 |
| 87.67199702491634 | 10.948 | 54.954 | 979.309 | 981.123 |
| 87.83004834510972 | 11.399 | 53.433 | 980.04 | 981.804 |
| 87.99739680178506 | 11.928 | 51.753 | 980.715 | 982.419 |
| 88.1647452584604 | 11.892 | 51.668 | 980.076 | 981.786 |
| 88.33209371513574 | 11.666 | 51.193 | 978.451 | 980.167 |
| 88.49944217181108 | 11.764 | 49.556 | 977.654 | 979.352 |
| 88.66679062848644 | 11.739 | 47.968 | 975.84 | 977.538 |
| 88.83413908516178 | 11.569 | 46.319 | 972.864 | 974.593 |
| 89.00148754183712 | 11.326 | 45.783 | 968.58 | 970.339 |
| 89.16883599851246 | 11.277 | 44.974 | 963.292 | 965.099 |
| 89.33618445518782 | 11.064 | 44.554 | 958.624 | 960.45 |
| 89.50353291186315 | 10.851 | 44.134 | 953.962 | 955.806 |
| 89.6708813685385 | 10.437 | 43.379 | 948.175 | 950.037 |
| 89.83822982521386 | 9.804 | 44.018 | 941.955 | 943.86 |
| 90.00557828188919 | 8.91 | 45.893 | 934.695 | 936.624 |
| 90.16362960208257 | 7.784 | 48.011 | 925.365 | 927.282 |
| 90.3309780587579 | 7.041 | 49.13 | 917.295 | 919.225 |
| 90.49832651543326 | 6.755 | 50.007 | 910.857 | 912.804 |
| 90.66567497210859 | 7.096 | 49.934 | 906.323 | 908.252 |
| 90.83302342878395 | 7.279 | 49.702 | 902.008 | 903.913 |
| 91.00037188545929 | 7.54 | 49.252 | 899.306 | 901.18 |
| 91.16772034213463 | 7.577 | 48.613 | 896.397 | 898.229 |
| 91.33506879880998 | 7.358 | 48.485 | 891.34 | 893.165 |
| 91.50241725548533 | 7.248 | 48.79 | 887.694 | 889.532 |
| 91.66976571216065 | 7.187 | 48.723 | 884.597 | 886.428 |
| 91.83711416883601 | 7.029 | 48.151 | 882.485 | 884.268 |
| 92.00446262551137 | 7.108 | 47.402 | 880.361 | 882.095 |
| 92.1718110821867 | 7.193 | 46.653 | 878.237 | 879.923 |
| 92.33915953886203 | 7.601 | 45.473 | 877.628 | 879.235 |
| 92.49721085905541 | 7.79 | 44.377 | 875.888 | 877.403 |
| 92.66455931573077 | 7.985 | 43.325 | 875.109 | 876.521 |
| 92.83190777240611 | 7.881 | 43.032 | 873.393 | 874.768 |
| 92.99925622908145 | 7.37 | 43.197 | 870.654 | 872.005 |
| 93.1666046857568 | 7.455 | 42.862 | 868.457 | 869.766 |
| 93.33395314243214 | 7.784 | 42.114 | 866.315 | 867.593 |
| 93.50130159910749 | 7.942 | 41.012 | 864.063 | 865.286 |
| 93.66865005578283 | 7.942 | 39.825 | 860.801 | 861.988 |
| 93.83599851245818 | 7.918 | 38.632 | 857.399 | 858.543 |
| 94.00334696913353 | 7.893 | 37.586 | 854.095 | 855.208 |
| 94.17069542580886 | 7.838 | 37.208 | 851.271 | 852.378 |
| 94.3380438824842 | 7.778 | 36.831 | 848.453 | 849.543 |
| 94.50539233915954 | 7.869 | 36.472 | 846.652 | 847.735 |
| 94.66344365935292 | 8.143 | 36.101 | 846.092 | 847.163 |
| 94.83079211602828 | 8.544 | 35.577 | 846.214 | 847.285 |
| 94.99814057270362 | 8.946 | 35.054 | 846.335 | 847.406 |
| 95.16548902937897 | 9.013 | 35.06 | 846.22 | 847.309 |
| 95.33283748605432 | 8.642 | 35.748 | 845.794 | 846.92 |
| 95.50018594272963 | 8.252 | 36.393 | 845.349 | 846.494 |
| 95.66753439940499 | 7.863 | 37.038 | 844.905 | 846.074 |
| 95.83488285608034 | 7.729 | 37.61 | 844.522 | 845.708 |
| 96.00223131275567 | 7.692 | 38.164 | 844.163 | 845.368 |
| 96.16957976943102 | 7.65 | 38.724 | 843.877 | 845.1 |
| 96.33692822610638 | 7.711 | 39.509 | 845.581 | 846.84 |
| 96.50427668278171 | 7.936 | 39.691 | 848.739 | 849.993 |
| 96.67162513945706 | 8.118 | 39.588 | 852.312 | 853.547 |
| 96.8389735961324 | 7.948 | 40.02 | 858.02 | 859.255 |
| 96.99702491632577 | 7.796 | 40.513 | 864.282 | 865.524 |
| 97.16437337300111 | 7.772 | 41.481 | 874.561 | 875.821 |
| 97.33172182967647 | 7.753 | 42.454 | 884.84 | 886.118 |
| 97.49907028635181 | 8.173 | 42.917 | 893.591 | 894.881 |
| 97.66641874302715 | 8.264 | 43.434 | 898.886 | 900.2 |
| 97.8337671997025 | 8.879 | 43.458 | 907.929 | 909.244 |
| 98.00111565637785 | 9.463 | 43.696 | 916.985 | 918.306 |
| 98.16846411305319 | 9.469 | 44.73 | 919.018 | 920.356 |
| 98.33581256972855 | 9.415 | 45.832 | 921.288 | 922.645 |
| 98.50316102640389 | 9.329 | 47.232 | 923.272 | 924.677 |
| 98.67050948307921 | 9.64 | 48.187 | 926.089 | 927.538 |
| 98.83785793975456 | 10.108 | 48.887 | 929.698 | 931.171 |
| 99.0052063964299 | 10.017 | 49.514 | 931.828 | 933.331 |
| 99.17255485310525 | 9.737 | 50.098 | 934.122 | 935.65 |
| 99.33060617329863 | 9.701 | 50.305 | 937.537 | 939.076 |
| 99.49795462997399 | 9.64 | 50.554 | 940.853 | 942.405 |
| 99.66530308664933 | 9.22 | 51.382 | 942.649 | 944.243 |
| 99.83265154332467 | 9.123 | 51.364 | 944.17 | 945.765 |
| 100.0 | 9.025 | 51.352 | 945.692 | 947.286 |